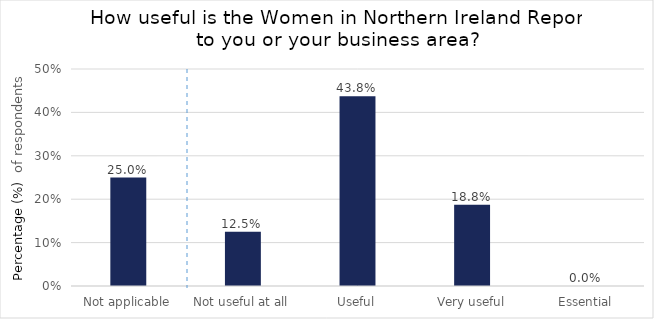
| Category | How useful is the Women in Northern Ireland Report to you or your business area? |
|---|---|
| Not applicable | 0.25 |
| Not useful at all | 0.125 |
| Useful | 0.438 |
| Very useful | 0.188 |
| Essential | 0 |